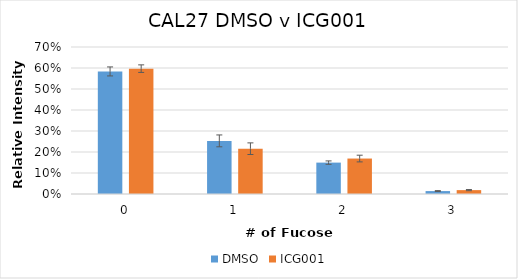
| Category | DMSO | ICG001 |
|---|---|---|
| 0.0 | 0.584 | 0.597 |
| 1.0 | 0.253 | 0.216 |
| 2.0 | 0.149 | 0.169 |
| 3.0 | 0.014 | 0.018 |